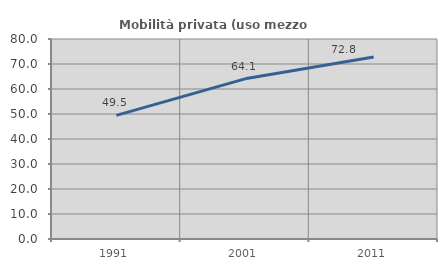
| Category | Mobilità privata (uso mezzo privato) |
|---|---|
| 1991.0 | 49.458 |
| 2001.0 | 64.062 |
| 2011.0 | 72.822 |